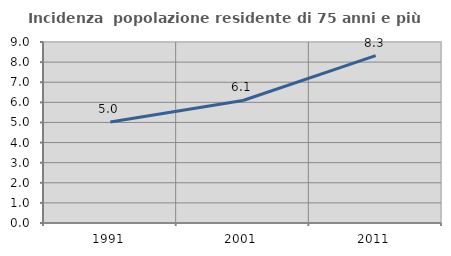
| Category | Incidenza  popolazione residente di 75 anni e più |
|---|---|
| 1991.0 | 5.025 |
| 2001.0 | 6.093 |
| 2011.0 | 8.32 |